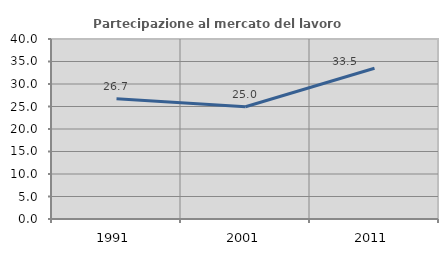
| Category | Partecipazione al mercato del lavoro  femminile |
|---|---|
| 1991.0 | 26.732 |
| 2001.0 | 24.951 |
| 2011.0 | 33.491 |